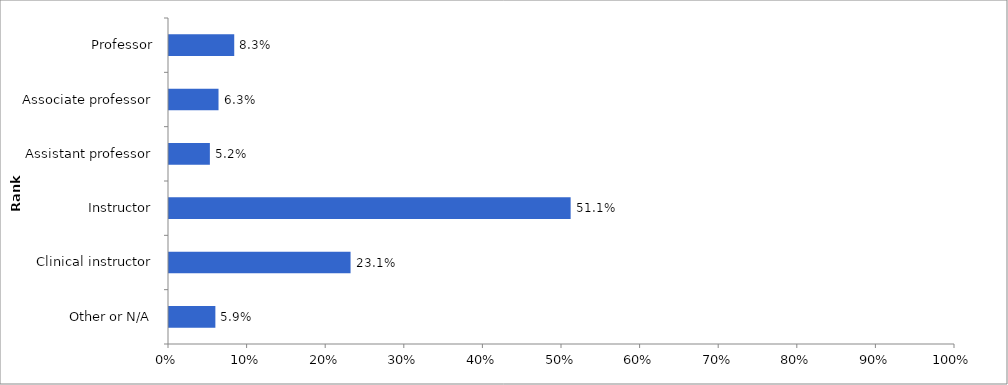
| Category | Series 0 |
|---|---|
| Other or N/A | 0.059 |
| Clinical instructor | 0.231 |
| Instructor | 0.511 |
| Assistant professor | 0.052 |
| Associate professor | 0.063 |
| Professor | 0.083 |